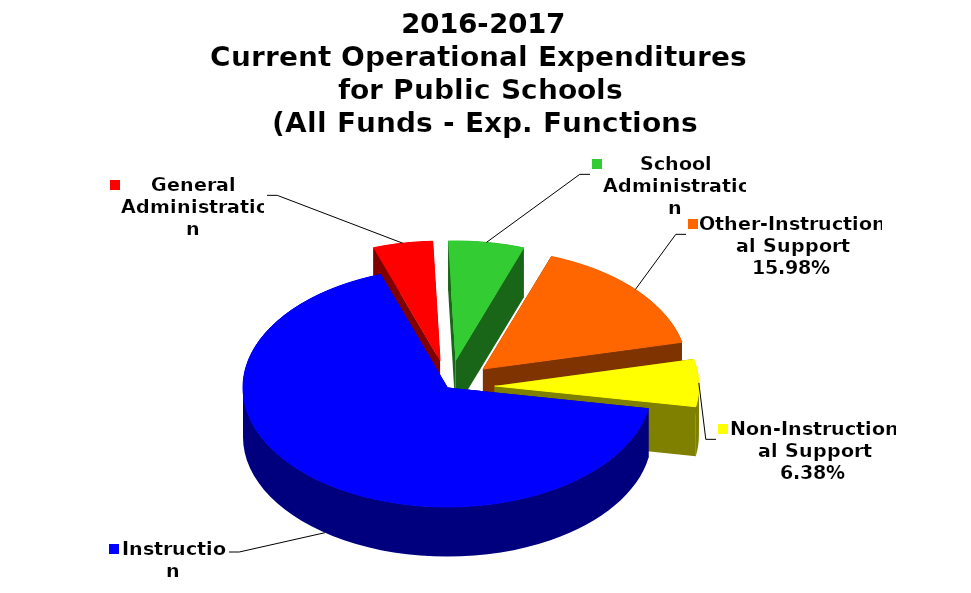
| Category | Series 0 |
|---|---|
| Instruction | 0.669 |
| General Administration | 0.047 |
| School Administration | 0.06 |
| Other-Instructional Support | 0.16 |
| Non-Instructional Support | 0.064 |